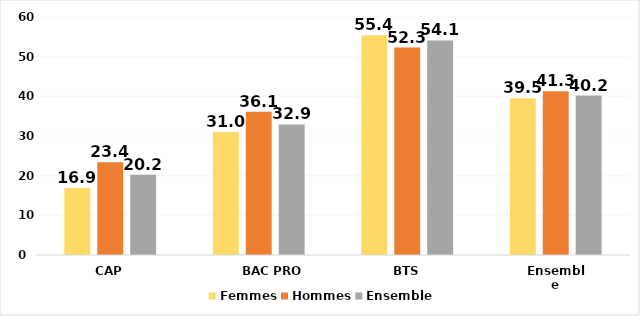
| Category | Femmes | Hommes | Ensemble |
|---|---|---|---|
| CAP | 16.9 | 23.4 | 20.2 |
| BAC PRO | 31 | 36.1 | 32.9 |
| BTS | 55.4 | 52.3 | 54.1 |
| Ensemble | 39.5 | 41.3 | 40.2 |